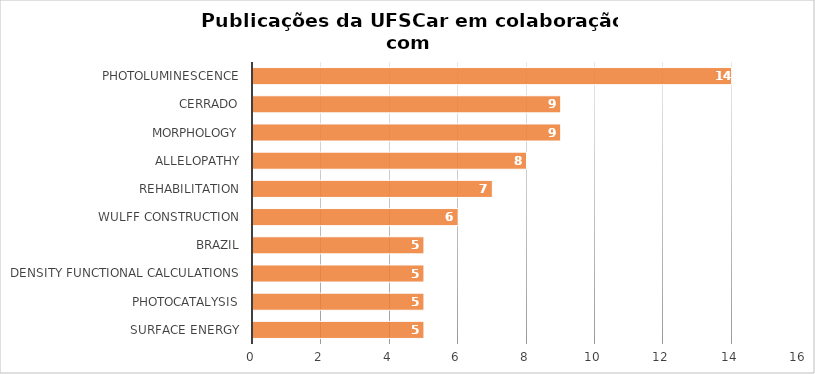
| Category | # Records |
|---|---|
| photoluminescence | 14 |
| cerrado | 9 |
| morphology | 9 |
| allelopathy | 8 |
| rehabilitation | 7 |
| wulff construction | 6 |
| brazil | 5 |
| density functional calculations | 5 |
| photocatalysis | 5 |
| surface energy | 5 |